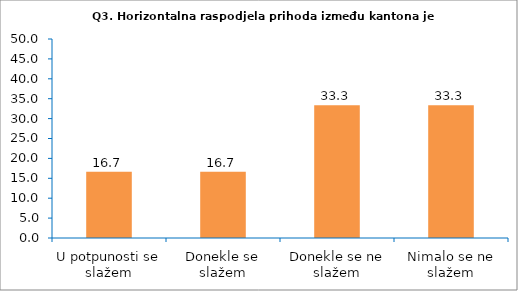
| Category | Series 0 |
|---|---|
| U potpunosti se slažem | 16.667 |
| Donekle se slažem | 16.667 |
| Donekle se ne slažem | 33.333 |
| Nimalo se ne slažem | 33.333 |